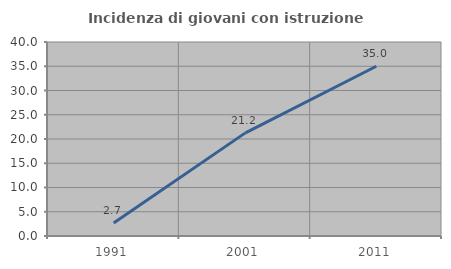
| Category | Incidenza di giovani con istruzione universitaria |
|---|---|
| 1991.0 | 2.703 |
| 2001.0 | 21.212 |
| 2011.0 | 35 |